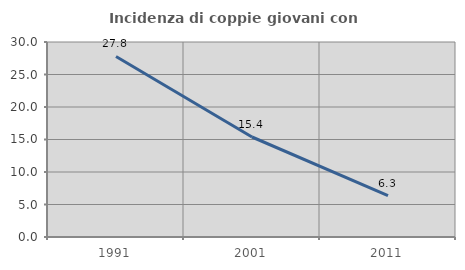
| Category | Incidenza di coppie giovani con figli |
|---|---|
| 1991.0 | 27.778 |
| 2001.0 | 15.385 |
| 2011.0 | 6.349 |